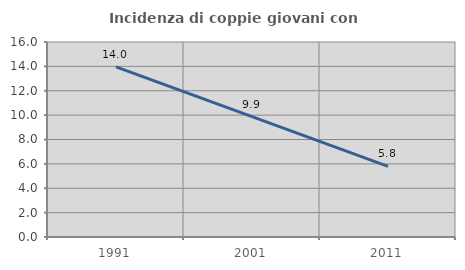
| Category | Incidenza di coppie giovani con figli |
|---|---|
| 1991.0 | 13.963 |
| 2001.0 | 9.873 |
| 2011.0 | 5.802 |